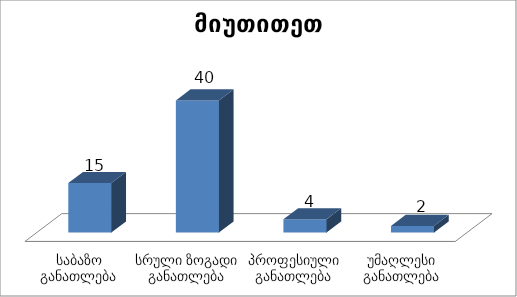
| Category | მიუთითეთ განათლება |
|---|---|
| საბაზო განათლება | 15 |
| სრული ზოგადი განათლება | 40 |
| პროფესიული განათლება | 4 |
| უმაღლესი განათლება | 2 |